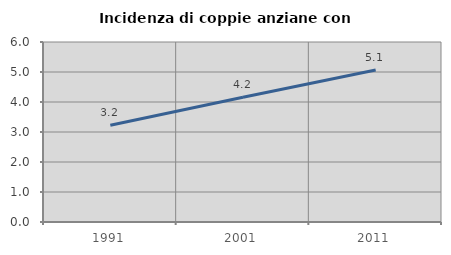
| Category | Incidenza di coppie anziane con figli |
|---|---|
| 1991.0 | 3.226 |
| 2001.0 | 4.158 |
| 2011.0 | 5.068 |